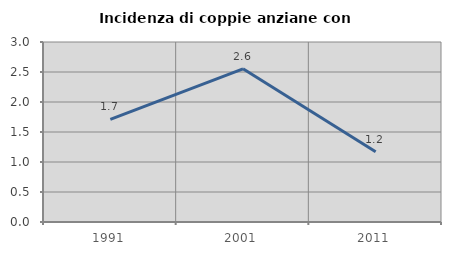
| Category | Incidenza di coppie anziane con figli |
|---|---|
| 1991.0 | 1.709 |
| 2001.0 | 2.553 |
| 2011.0 | 1.172 |